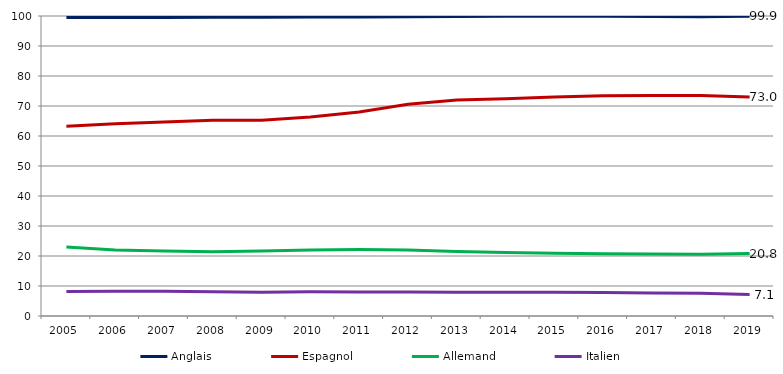
| Category | Anglais | Espagnol | Allemand | Italien |
|---|---|---|---|---|
| 2005 | 99.52 | 63.23 | 23.004 | 8.128 |
| 2006 | 99.509 | 64.115 | 22.004 | 8.236 |
| 2007 | 99.511 | 64.643 | 21.658 | 8.261 |
| 2008 | 99.574 | 65.23 | 21.435 | 8.106 |
| 2009 | 99.584 | 65.234 | 21.701 | 7.897 |
| 2010 | 99.658 | 66.308 | 22.01 | 8.042 |
| 2011 | 99.702 | 68.013 | 22.179 | 7.995 |
| 2012 | 99.791 | 70.587 | 22.035 | 8.001 |
| 2013 | 99.865 | 71.998 | 21.487 | 7.95 |
| 2014 | 99.882 | 72.405 | 21.129 | 7.911 |
| 2015 | 99.905 | 72.974 | 20.878 | 7.893 |
| 2016 | 99.91 | 73.404 | 20.752 | 7.802 |
| 2017 | 99.846 | 73.502 | 20.627 | 7.693 |
| 2018 | 99.767 | 73.51 | 20.569 | 7.6 |
| 2019 | 99.882 | 72.961 | 20.805 | 7.131 |